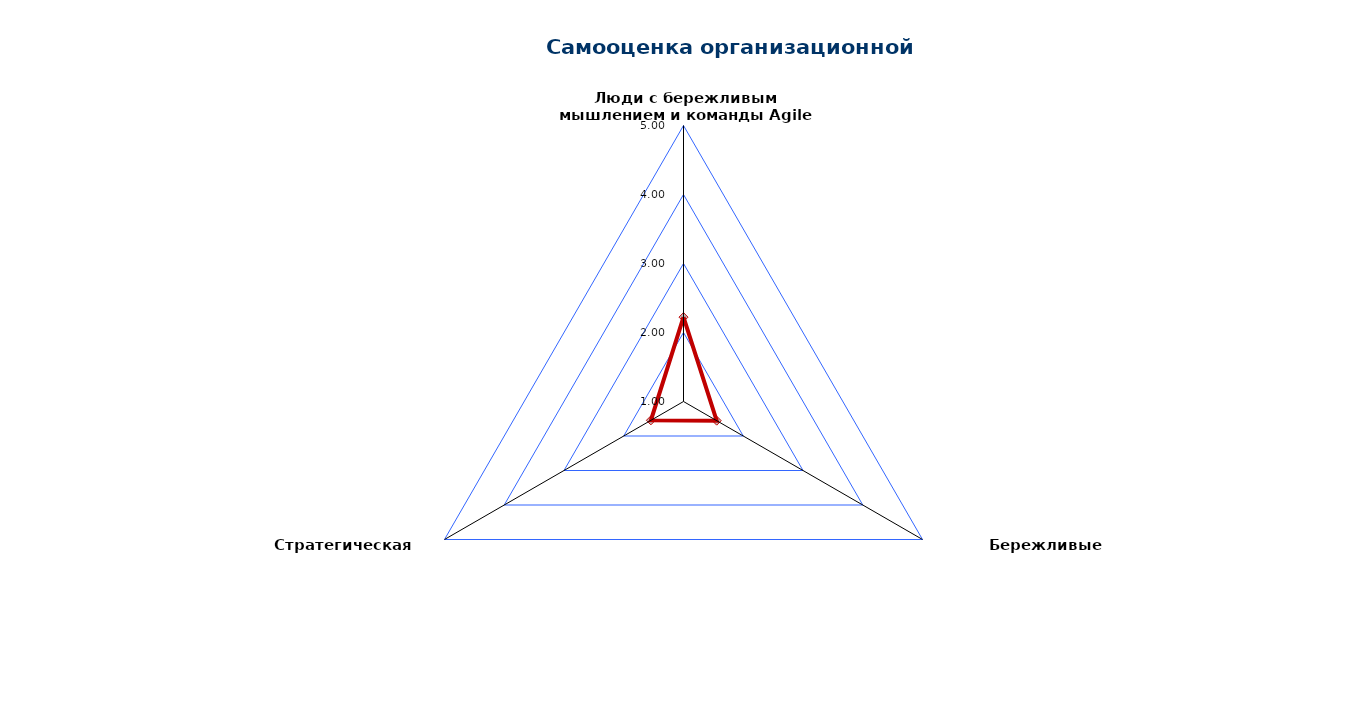
| Category | Самооценка организационной гибкости |
|---|---|
| Люди с бережливым мышлением и команды Agile | 2.222 |
| Бережливые бизнес-процессы | 1.556 |
| Стратегическая гибкость | 1.545 |